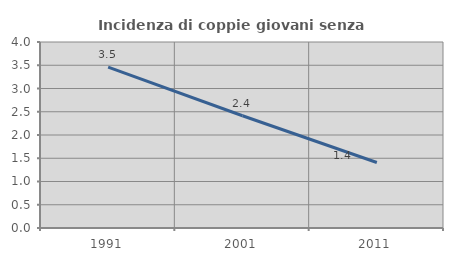
| Category | Incidenza di coppie giovani senza figli |
|---|---|
| 1991.0 | 3.462 |
| 2001.0 | 2.413 |
| 2011.0 | 1.408 |